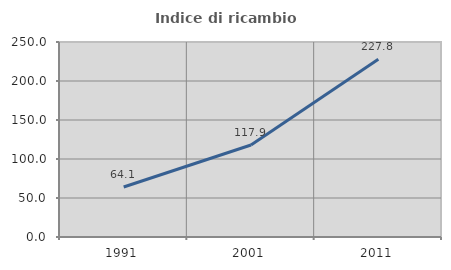
| Category | Indice di ricambio occupazionale  |
|---|---|
| 1991.0 | 64.13 |
| 2001.0 | 117.91 |
| 2011.0 | 227.778 |